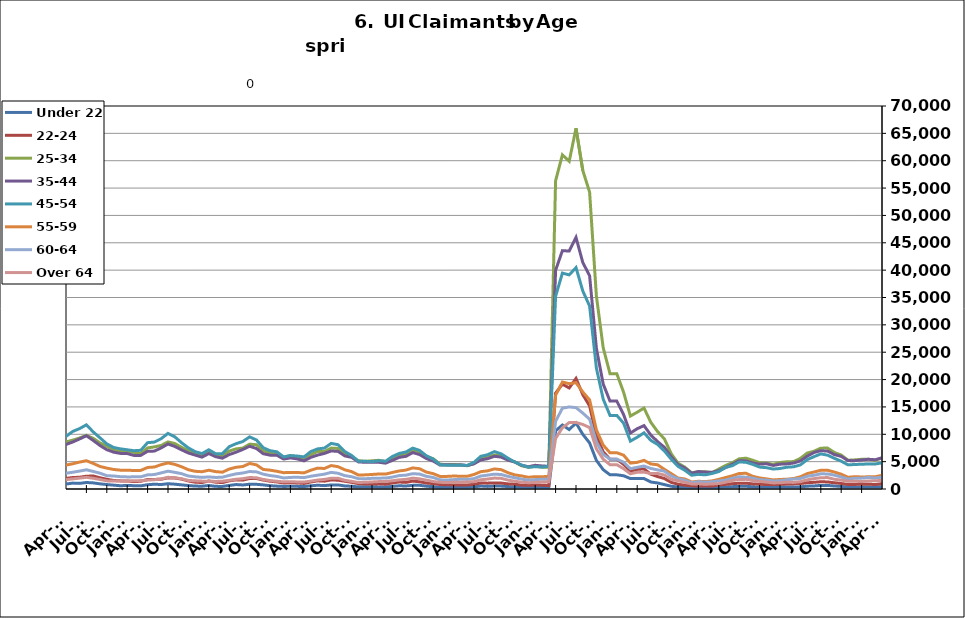
| Category | Under 22 | 22-24 | 25-34 | 35-44 | 45-54 | 55-59 | 60-64 | Over 64 |
|---|---|---|---|---|---|---|---|---|
| 1995-02-28 | 535 | 933 | 5740 | 6206 | 4029 | 1255 | 625 | 276 |
| 1995-03-31 | 534 | 992 | 5856 | 6433 | 4297 | 1294 | 686 | 323 |
| 1995-04-30 | 603 | 1125 | 6814 | 6965 | 4447 | 1392 | 730 | 338 |
| 1995-05-31 | 626 | 1171 | 7442 | 7404 | 4702 | 1383 | 751 | 333 |
| 1995-06-30 | 625 | 1218 | 7514 | 7778 | 4867 | 1435 | 813 | 366 |
| 1995-07-31 | 710 | 1296 | 8612 | 8864 | 5537 | 1595 | 891 | 407 |
| 1995-08-31 | 729 | 1248 | 8185 | 8719 | 5400 | 1604 | 982 | 406 |
| 1995-09-30 | 578 | 1028 | 6615 | 7150 | 4534 | 1351 | 862 | 338 |
| 1995-10-31 | 554 | 957 | 5805 | 6461 | 4159 | 1205 | 741 | 287 |
| 1995-11-30 | 468 | 845 | 5201 | 5826 | 3927 | 1155 | 702 | 254 |
| 1995-12-31 | 517 | 858 | 5350 | 5974 | 4010 | 1153 | 672 | 263 |
| 1996-01-31 | 543 | 927 | 5431 | 6086 | 4208 | 1221 | 685 | 301 |
| 1996-02-29 | 617 | 999 | 5667 | 6535 | 4480 | 1312 | 747 | 305 |
| 1996-03-31 | 622 | 981 | 5896 | 6557 | 4514 | 1362 | 763 | 306 |
| 1996-04-30 | 680 | 1140 | 7032 | 7649 | 5088 | 1527 | 856 | 345 |
| 1996-05-31 | 689 | 1163 | 7220 | 7819 | 5070 | 1521 | 832 | 366 |
| 1996-06-30 | 661 | 1145 | 7344 | 8173 | 5391 | 1568 | 844 | 388 |
| 1996-07-31 | 762 | 1250 | 8375 | 9181 | 6036 | 1755 | 973 | 432 |
| 1996-08-31 | 746 | 1145 | 7829 | 8585 | 5586 | 1651 | 950 | 435 |
| 1996-09-30 | 635 | 992 | 6399 | 7097 | 4790 | 1462 | 804 | 425 |
| 1996-10-31 | 572 | 851 | 5448 | 6291 | 4192 | 1259 | 693 | 340 |
| 1996-11-30 | 531 | 827 | 5003 | 5921 | 3908 | 1153 | 602 | 315 |
| 1996-12-31 | 521 | 789 | 4710 | 5510 | 3673 | 1110 | 610 | 284 |
| 1997-01-31 | 559 | 841 | 5203 | 6172 | 4321 | 1255 | 731 | 328 |
| 1997-02-28 | 556 | 841 | 5187 | 6162 | 4311 | 1250 | 727 | 326 |
| 1997-03-31 | 499 | 806 | 5125 | 6037 | 4176 | 1294 | 702 | 363 |
| 1997-04-30 | 545 | 885 | 5753 | 6709 | 4248 | 1339 | 734 | 339 |
| 1997-05-31 | 612 | 941 | 6146 | 7153 | 4458 | 1348 | 801 | 336 |
| 1997-06-30 | 623 | 995 | 6240 | 7298 | 4662 | 1302 | 776 | 348 |
| 1997-07-31 | 716 | 1154 | 7168 | 8554 | 5489 | 1509 | 903 | 415 |
| 1997-08-31 | 684 | 1072 | 6853 | 8093 | 5222 | 1487 | 837 | 416 |
| 1997-09-30 | 579 | 912 | 5522 | 6592 | 4348 | 1285 | 705 | 380 |
| 1997-10-31 | 516 | 817 | 4894.5 | 5892.5 | 3945 | 1159 | 625 | 344.5 |
| 1997-11-30 | 453 | 722 | 4267 | 5193 | 3542 | 1033 | 545 | 309 |
| 1997-12-31 | 413 | 682 | 3792 | 4755 | 3300 | 1023 | 490 | 266 |
| 1998-01-31 | 489 | 741 | 4044 | 5115 | 3513 | 1099 | 525 | 267 |
| 1998-02-28 | 435 | 684 | 3864 | 4903 | 3549 | 1043 | 571 | 285 |
| 1998-03-31 | 416 | 680 | 3855 | 5086 | 3703 | 1176 | 604 | 297 |
| 1998-04-30 | 592 | 813 | 5092 | 6219 | 4262 | 1336 | 688 | 332 |
| 1998-05-31 | 579 | 849 | 5319 | 6766 | 4554 | 1382 | 729 | 360 |
| 1998-06-30 | 568 | 899 | 5557 | 7101 | 4897 | 1405 | 783 | 367 |
| 1998-07-31 | 691 | 1031 | 6472 | 8095 | 5562 | 1589 | 880 | 392 |
| 1998-08-31 | 673 | 1007 | 6326 | 7950 | 5369 | 1574 | 935 | 393 |
| 1998-09-30 | 548 | 838 | 5206 | 6768 | 4703 | 1432 | 849 | 373 |
| 1998-10-31 | 496 | 776 | 4437 | 5582 | 3875 | 1250 | 711 | 302 |
| 1998-11-30 | 456 | 761 | 4182 | 5332 | 4015 | 1296 | 694 | 308 |
| 1998-12-31 | 442 | 722 | 4010 | 5198 | 4062 | 1331 | 656 | 290 |
| 1999-01-31 | 503 | 830 | 4502 | 5761 | 4521 | 1490 | 751 | 297 |
| 1999-02-28 | 463 | 756 | 4267 | 5576 | 4431 | 1470 | 767 | 301 |
| 1999-03-31 | 435 | 688 | 4119 | 5519 | 4403 | 1516 | 765 | 331 |
| 1999-04-30 | 591 | 949 | 5292 | 7089 | 5468 | 1724 | 914 | 489 |
| 1999-05-31 | 674 | 911 | 5611 | 7459 | 5457 | 1710 | 934 | 500 |
| 1999-06-30 | 640 | 906 | 5660 | 7503 | 5333 | 1695 | 920 | 495 |
| 1999-07-31 | 766 | 1132 | 6820 | 9256 | 6620 | 1981 | 1001 | 549 |
| 1999-08-31 | 738 | 1117 | 6737 | 9030 | 6670 | 2019 | 1075 | 582 |
| 1999-09-30 | 600 | 968 | 5167 | 7169 | 5458 | 1712 | 892 | 465 |
| 1999-10-31 | 494 | 813 | 4501 | 6048 | 4682 | 1443 | 743 | 363 |
| 1999-11-30 | 464 | 768 | 4228 | 5593 | 4564 | 1392 | 702 | 313 |
| 1999-12-31 | 468.5 | 754.5 | 4149 | 5486.5 | 4505 | 1429 | 673 | 304 |
| 2000-01-31 | 473 | 741 | 4070 | 5380 | 4446 | 1466 | 644 | 295 |
| 2000-02-29 | 460 | 691 | 3807 | 5357 | 4470 | 1469 | 707 | 310 |
| 2000-03-31 | 412 | 652 | 3864 | 5499 | 4568 | 1508 | 816 | 389 |
| 2000-04-30 | 585 | 829 | 4741 | 6891 | 5127 | 1631 | 906 | 451 |
| 2000-05-31 | 627 | 875 | 5086 | 7211 | 5238 | 1598 | 956 | 489 |
| 2000-06-30 | 675 | 983 | 5624 | 7826 | 5562 | 1669 | 941 | 524 |
| 2000-07-31 | 802 | 1109 | 6475 | 9102 | 6450 | 1927 | 1097 | 594 |
| 2000-08-31 | 787 | 1058 | 6045 | 8732 | 6157 | 1894 | 1085 | 616 |
| 2000-09-30 | 607 | 897 | 4766 | 6864 | 5037 | 1486 | 902 | 479 |
| 2000-10-31 | 544 | 760 | 4267 | 5897 | 4465 | 1323 | 762 | 394 |
| 2000-11-30 | 535 | 797 | 3982 | 5439 | 4318 | 1256 | 702 | 396 |
| 2000-12-31 | 508 | 832 | 3891 | 5255 | 4218 | 1246 | 694 | 361 |
| 2001-01-31 | 627 | 892 | 4229 | 5724 | 4777 | 1300 | 721 | 393 |
| 2001-02-28 | 643 | 934 | 4553 | 6302 | 5224 | 1529 | 849 | 472 |
| 2001-03-31 | 412 | 648 | 3625 | 5081 | 4551 | 1413 | 778 | 440 |
| 2001-04-30 | 875 | 1276 | 6577 | 8914 | 7196 | 2144 | 1185 | 639 |
| 2001-05-31 | 944 | 1399 | 7133 | 9570 | 7651 | 2265 | 1231 | 679 |
| 2001-06-30 | 1041 | 1584 | 8072 | 11034 | 8621 | 2613 | 1398 | 756 |
| 2001-07-31 | 1135 | 1806 | 9038 | 12514 | 9691 | 2970 | 1611 | 848 |
| 2001-08-31 | 1116 | 1776 | 8753 | 12045 | 9560 | 2963 | 1691 | 898 |
| 2001-09-30 | 1046 | 1705 | 8118 | 11025 | 8788 | 2784 | 1608 | 833 |
| 2001-10-31 | 1094 | 1785 | 8459 | 11114 | 8850 | 2772 | 1610 | 777 |
| 2001-11-30 | 1154 | 1931 | 9131 | 11576 | 9447 | 2973 | 1661 | 778 |
| 2001-12-31 | 1280 | 2191 | 9917 | 11961 | 9905 | 3152 | 1740 | 780 |
| 2002-01-31 | 1330 | 2255 | 10364 | 12730 | 10592 | 3378 | 1843 | 821 |
| 2002-02-28 | 1347 | 2339 | 10349 | 12730 | 10784 | 3499 | 1861 | 867 |
| 2002-03-31 | 1266 | 2231 | 9963 | 12747 | 10614 | 3499 | 1867 | 979 |
| 2002-04-30 | 1412 | 2488 | 11603 | 15825 | 13571 | 4631 | 2389 | 1146 |
| 2002-05-31 | 1455 | 2421 | 11243 | 15509 | 13148 | 4374 | 2359 | 1195 |
| 2002-06-30 | 1534 | 2479 | 11416 | 15594 | 13261 | 4343 | 2365 | 1180 |
| 2002-07-31 | 1513 | 2614 | 11895 | 16242 | 13727 | 4439 | 2428 | 1255 |
| 2002-08-31 | 1022 | 1977 | 8719 | 12054 | 10588 | 3454 | 1990 | 1047 |
| 2002-09-30 | 1391 | 2528 | 10478 | 14010 | 12008 | 3847 | 2161 | 1166 |
| 2002-10-31 | 1401 | 2385 | 9826 | 12727 | 10778 | 3498 | 1886 | 973 |
| 2002-11-30 | 1344 | 2390 | 9846 | 12059 | 10297 | 3367 | 1833 | 958 |
| 2002-12-31 | 1311 | 2403 | 9841 | 11670 | 10177 | 3369 | 1871 | 894 |
| 2003-01-31 | 1311 | 2403 | 9841 | 11670 | 10177 | 3369 | 1871 | 894 |
| 2003-02-28 | 1367 | 2275 | 9730 | 12433 | 10806 | 3687 | 2016 | 974 |
| 2003-03-31 | 1367 | 2357 | 9844 | 12620 | 11167 | 3825 | 2151 | 1094 |
| 2003-04-30 | 1549 | 2525 | 10619 | 14142 | 12182 | 4004 | 2304 | 1190 |
| 2003-05-31 | 1663 | 2698 | 10843 | 14795 | 12539 | 4102 | 2395 | 1256 |
| 2003-06-30 | 1755 | 2770 | 11350 | 15575 | 13251 | 4301 | 2493 | 1325 |
| 2003-07-31 | 1748 | 2791 | 11577 | 15863 | 13772 | 4465 | 2593 | 1371 |
| 2003-08-31 | 1718 | 2653 | 10998 | 15261 | 13219 | 4325 | 2522 | 1359 |
| 2003-09-30 | 1494 | 2521 | 10071 | 13565 | 11659 | 3828 | 2278 | 1286 |
| 2003-10-31 | 1329 | 2432 | 9388 | 12107 | 10693 | 3567 | 2036 | 1129 |
| 2003-11-30 | 1191 | 2226 | 8954 | 11297 | 10037 | 3414 | 2004 | 1068 |
| 2003-12-31 | 1206 | 2184 | 8530 | 10413 | 9335 | 3215 | 1854 | 994 |
| 2004-01-31 | 1216 | 2171 | 8382 | 9858 | 8955 | 2992 | 1736 | 963 |
| 2004-02-29 | 1118 | 1879 | 7614 | 8935 | 8176 | 2761 | 1617 | 943 |
| 2004-03-31 | 1099 | 1749 | 7152 | 8565 | 7769 | 2686 | 1608 | 981 |
| 2004-04-30 | 1241 | 1951 | 7653 | 9981 | 8741 | 2872 | 1685 | 1056 |
| 2004-05-31 | 1245 | 1934 | 7651 | 10203 | 8820 | 2928 | 1703 | 1079 |
| 2004-06-30 | 1316 | 2086 | 8172 | 10636 | 9362 | 3146 | 1843 | 1081 |
| 2004-07-31 | 1476 | 2265 | 8795 | 11511 | 10439 | 3497 | 2008 | 1171 |
| 2004-08-31 | 1390 | 2055 | 8008 | 10418 | 9514 | 3304 | 1909 | 1105 |
| 2004-09-30 | 1129 | 1820 | 6987 | 8661 | 7694 | 2755 | 1623 | 1046 |
| 2004-10-31 | 1037 | 1675 | 6590 | 7964 | 7029 | 2459 | 1461 | 882 |
| 2004-11-30 | 954 | 1638 | 6342 | 7570 | 6733 | 2294 | 1383 | 841 |
| 2004-12-31 | 857 | 1533 | 5921 | 6991 | 6333 | 2225 | 1287 | 764 |
| 2005-01-31 | 893 | 1539 | 6047 | 7410 | 6682 | 2253 | 1274 | 788 |
| 2005-02-28 | 846 | 1361 | 5650 | 6952 | 6404 | 2198 | 1326 | 786 |
| 2005-03-31 | 747 | 1258 | 5313 | 6595 | 6251 | 2151 | 1327 | 742 |
| 2005-04-30 | 877 | 1375 | 5696 | 7717 | 7230 | 2440 | 1401 | 844 |
| 2005-05-31 | 854 | 1408 | 5674 | 7905 | 7454 | 2482 | 1453 | 858 |
| 2005-06-30 | 819 | 1444 | 6028 | 8565 | 7899 | 2613 | 1547 | 890 |
| 2005-07-31 | 900 | 1461 | 6395 | 9124 | 8614 | 2864 | 1640 | 1004 |
| 2005-08-31 | 805 | 1439 | 5917 | 8271 | 8076 | 2692 | 1587 | 945 |
| 2005-09-30 | 631 | 1209 | 4978 | 6413 | 6203 | 2116 | 1312 | 724 |
| 2005-10-31 | 638 | 1134 | 4602 | 6028 | 5688 | 1997 | 1171 | 656 |
| 2005-11-30 | 564 | 1071 | 4409 | 5563 | 5105 | 1791 | 1035 | 580 |
| 2005-12-31 | 523 | 987 | 4014 | 4983 | 4531 | 1673 | 968 | 546 |
| 2006-01-31 | 531 | 925 | 3900 | 5012 | 4793 | 1691 | 1008 | 539 |
| 2006-02-28 | 447 | 804 | 3534 | 4388 | 4403 | 1586 | 980 | 549 |
| 2006-03-31 | 399 | 785 | 3455 | 4472 | 4584 | 1680 | 1069 | 618 |
| 2006-04-30 | 527 | 945 | 4004 | 5859 | 5921 | 1965 | 1251 | 744 |
| 2006-05-31 | 594 | 964 | 4205 | 6365 | 6369 | 2156 | 1327 | 792 |
| 2006-06-30 | 660 | 1113 | 4742 | 7052 | 7094 | 2386 | 1474 | 933 |
| 2006-07-31 | 771 | 1183 | 5214 | 7974 | 8007 | 2685 | 1635 | 1072 |
| 2006-08-31 | 737 | 1202 | 5116 | 7524 | 7553 | 2671 | 1590 | 1019 |
| 2006-09-30 | 596 | 1086 | 4608 | 6175 | 6389 | 2256 | 1287 | 812 |
| 2006-10-31 | 596 | 1056 | 4585 | 5758 | 5788 | 2026 | 1164 | 696 |
| 2006-11-30 | 542 | 1003 | 4370 | 5304 | 5388 | 1812 | 1082 | 604 |
| 2006-12-31 | 553 | 1102 | 4425 | 5291 | 5310 | 1801 | 1099 | 603 |
| 2007-01-31 | 587 | 1147 | 4542 | 5619 | 5506 | 1920 | 1174 | 663 |
| 2007-02-28 | 544 | 1090 | 4490 | 5562 | 5616 | 1982 | 1260 | 705 |
| 2007-03-31 | 558 | 1089 | 4498 | 5595 | 5708 | 2016 | 1378 | 717 |
| 2007-04-30 | 760 | 1203 | 5015 | 6827 | 6871 | 2316 | 1536 | 856 |
| 2007-05-31 | 806 | 1285 | 5542 | 7679 | 7763 | 2571 | 1719 | 1021 |
| 2007-06-30 | 862 | 1340 | 6100 | 8324 | 8341 | 2812 | 1896 | 1060 |
| 2007-07-31 | 980 | 1524 | 6616 | 9184 | 9522 | 3226 | 2038 | 1250 |
| 2007-08-31 | 950 | 1510 | 6266 | 8359 | 8842 | 3033 | 1949 | 1157 |
| 2007-09-30 | 865 | 1595 | 6213 | 7798 | 7957 | 2790 | 1816 | 1090 |
| 2007-10-31 | 883 | 1517 | 6214 | 7229 | 7503 | 2574 | 1630 | 978 |
| 2007-11-15 | 816 | 1424 | 5981 | 6740 | 6999 | 2468 | 1510 | 860 |
| 2007-12-15 09:36:00 | 851 | 1536 | 6411 | 6986 | 7174 | 2572 | 1584 | 874 |
| 2008-01-14 19:12:00 | 963 | 1628 | 6836 | 7533 | 7742 | 2786 | 1744 | 940 |
| 2008-02-14 04:48:00 | 982 | 1565 | 6847 | 7767 | 8031 | 2958 | 1823 | 985 |
| 2008-03-15 14:24:00 | 1029 | 1666 | 7210 | 8036 | 8353 | 3105 | 1898 | 1085 |
| 2008-04-15 | 1182 | 1889 | 7894 | 9339 | 9822 | 3537 | 2184 | 1246 |
| 2008-05-15 09:36:00 | 1325 | 2099 | 8651 | 10315 | 11003 | 3871 | 2423 | 1448 |
| 2008-06-14 19:12:00 | 1405 | 2238 | 9567 | 11330 | 12040 | 4322 | 2650 | 1572 |
| 2008-07-15 04:48:00 | 1616 | 2488 | 10336 | 12349 | 13396 | 4698 | 3083 | 1801 |
| 2008-08-14 14:24:00 | 1753 | 2665 | 10716 | 12486 | 13444 | 4795 | 3139 | 1802 |
| 2008-09-14 | 1800 | 2924 | 11552 | 12686 | 13602 | 4801 | 3180 | 1811 |
| 2008-10-14 09:36:00 | 1936 | 3131 | 12284 | 13322 | 13831 | 4989 | 3183 | 1808 |
| 2008-11-13 19:12:00 | 2093 | 3414 | 13577 | 14724 | 15130 | 5413 | 3440 | 1946 |
| 2008-12-14 04:48:00 | 2495 | 4020 | 15380 | 16325 | 16846 | 6098 | 3755 | 2155 |
| 2009-01-13 14:24:00 | 3054 | 4678 | 17678 | 18452 | 19095 | 6788 | 4182 | 2364 |
| 2009-02-13 | 3531 | 5304 | 19793 | 20788 | 21601 | 7727 | 4836 | 2718 |
| 2009-03-15 09:36:00 | 3891 | 5925 | 22303 | 23139 | 24352 | 8876 | 5515 | 3141 |
| 2009-04-14 19:12:00 | 4291 | 6403 | 23925 | 25362 | 26817 | 9618 | 6020 | 3494 |
| 2009-05-15 04:48:00 | 4410 | 6521 | 24301 | 25794 | 27238 | 9735 | 6181 | 3529 |
| 2009-06-14 14:24:00 | 4405 | 6853 | 25234 | 26806 | 28296 | 10256 | 6673 | 3804 |
| 2009-07-15 | 4729 | 7280 | 26132 | 27836 | 29724 | 10830 | 6950 | 4125 |
| 2009-08-14 09:36:00 | 4717 | 7069 | 25281 | 26184 | 27877 | 10164 | 6719 | 3918 |
| 2009-09-13 19:12:00 | 4741 | 7291 | 25029 | 24981 | 26018 | 9679 | 6210 | 3594 |
| 2009-10-14 04:48:00 | 4656 | 7051 | 24241 | 23779 | 24730 | 9034 | 5817 | 3422 |
| 2009-11-13 14:24:00 | 4421 | 6817 | 23760 | 22851 | 23515 | 8627 | 5549 | 3297 |
| 2009-12-14 | 4232 | 6586 | 23118 | 22038 | 22501 | 8496 | 5370 | 3295 |
| 2010-01-13 09:36:00 | 4276 | 6583 | 22706 | 21421 | 22132 | 8135 | 5154 | 3134 |
| 2010-02-12 19:12:00 | 4133 | 6142 | 21386 | 20012 | 21036 | 7728 | 5039 | 3047 |
| 2010-03-15 04:48:00 | 3784 | 5822 | 20418 | 19073 | 20556 | 7446 | 4983 | 3062 |
| 2010-04-14 14:24:00 | 3731 | 5751 | 20058 | 19261 | 21012 | 7449 | 5078 | 2936 |
| 2010-05-15 | 3516 | 5553 | 19393 | 18793 | 20409 | 7213 | 4923 | 2915 |
| 2010-06-14 09:36:00 | 3450 | 5640 | 19615 | 19385 | 20781 | 7547 | 5293 | 3043 |
| 2010-07-14 19:12:00 | 3536 | 5781 | 19820 | 19714 | 21269 | 7946 | 5439 | 3330 |
| 2010-08-14 04:48:00 | 3477 | 5590 | 18902 | 18548 | 19686 | 7561 | 5039 | 3181 |
| 2010-09-13 14:24:00 | 3083 | 5332 | 17344 | 16712 | 17408 | 6775 | 4612 | 2859 |
| 2010-10-14 | 3004 | 5138 | 17187 | 16492 | 17042 | 6713 | 4418 | 2779 |
| 2010-11-13 09:36:00 | 2724 | 4771 | 16387 | 15438 | 16061 | 6360 | 4209 | 2601 |
| 2010-12-13 19:12:00 | 2335 | 4159 | 15175 | 14143 | 14646 | 5823 | 4003 | 2480 |
| 2011-01-13 04:48:00 | 2530 | 4343 | 15492 | 14596 | 15561 | 6250 | 4059 | 2487 |
| 2011-02-12 14:24:00 | 2609 | 4202 | 15131 | 14142 | 15320 | 6044 | 4041 | 2517 |
| 2011-03-15 | 2290 | 3998 | 14370 | 13505 | 14523 | 5925 | 3990 | 2470 |
| 2011-04-14 09:36:00 | 2563 | 4190 | 14834 | 14445 | 15508 | 6130 | 3916 | 2488 |
| 2011-05-14 19:12:00 | 2642 | 4217 | 14917 | 14494 | 16051 | 6156 | 4129 | 2602 |
| 2011-06-14 04:48:00 | 2767 | 4676 | 17673 | 17404 | 19563 | 7763 | 5398 | 3653 |
| 2011-07-14 14:24:00 | 3027 | 4815 | 17530 | 17197 | 19880 | 7870 | 5384 | 3686 |
| 2011-08-14 | 2900 | 4498 | 15970 | 15020 | 17035 | 6697 | 4394 | 2956 |
| 2011-09-13 09:36:00 | 2531 | 4156 | 14609 | 13818 | 15092 | 5903 | 3881 | 2687 |
| 2011-10-13 19:12:00 | 2452 | 3959 | 14501 | 13415 | 14565 | 5635 | 3734 | 2491 |
| 2011-11-13 04:48:00 | 2197 | 3615 | 13732 | 12410 | 13698 | 5345 | 3574 | 2339 |
| 2011-12-13 14:24:00 | 1938 | 3290 | 13130 | 11646 | 13054 | 5089 | 3380 | 2177 |
| 2012-01-13 | 2098 | 3424 | 13293 | 11897 | 13400 | 5218 | 3448 | 2197 |
| 2012-02-12 09:36:00 | 2047 | 3428 | 12569 | 11400 | 12931 | 5177 | 3445 | 2212 |
| 2012-03-13 19:12:00 | 1870 | 3252 | 11913 | 10922 | 12476 | 4948 | 3317 | 2155 |
| 2012-04-13 04:48:00 | 2063 | 3590 | 12479 | 11814 | 13464 | 5278 | 3509 | 2287 |
| 2012-05-13 14:24:00 | 2260 | 3828 | 12852 | 12063 | 14139 | 5562 | 3628 | 2485 |
| 2012-06-13 | 2147 | 3747 | 13008 | 12659 | 14694 | 5791 | 3902 | 2736 |
| 2012-07-13 09:36:00 | 2358 | 4087 | 14109 | 13412 | 15770 | 6346 | 4156 | 3086 |
| 2012-08-12 19:12:00 | 1887 | 3284 | 11852 | 11102 | 13153 | 5396 | 3487 | 2583 |
| 2012-09-12 04:48:00 | 1524 | 2903 | 10742 | 10051 | 11393 | 4726 | 3103 | 2327 |
| 2012-10-12 14:24:00 | 1289 | 2603 | 10123 | 9339 | 10510 | 4405 | 2813 | 2032 |
| 2012-11-12 | 945 | 2155 | 8870 | 8273 | 9193 | 3781 | 2520 | 1702 |
| 2012-12-12 09:36:00 | 937 | 2201 | 8913 | 8210 | 9124 | 3816 | 2491 | 1722 |
| 2013-01-11 19:12:00 | 934 | 2199 | 9132 | 8579 | 9635 | 4095 | 2569 | 1667 |
| 2013-02-11 04:48:00 | 915 | 1996 | 8343 | 8072 | 9253 | 4034 | 2623 | 1715 |
| 2013-03-13 14:24:00 | 845 | 1934 | 8092 | 7955 | 9007 | 3929 | 2561 | 1667 |
| 2013-04-13 | 1055 | 2124 | 8637 | 8445 | 9891 | 4204 | 2666 | 1698 |
| 2013-05-13 09:36:00 | 1160 | 2394 | 9413 | 8898 | 10920 | 4574 | 2940 | 1871 |
| 2013-06-12 19:12:00 | 1145 | 2351 | 9732 | 9510 | 11293 | 4830 | 3115 | 1976 |
| 2013-07-13 04:48:00 | 1294 | 2558 | 10421 | 10174 | 12520 | 5363 | 3434 | 2233 |
| 2013-08-12 14:24:00 | 1238 | 2519 | 10150 | 9771 | 11886 | 5067 | 3372 | 2140 |
| 2013-09-12 | 1116 | 2214 | 9323 | 8874 | 10178 | 4389 | 2964 | 1871 |
| 2013-10-12 09:36:00 | 1000 | 2044 | 8893 | 8509 | 9449 | 4200 | 2701 | 1709 |
| 2013-11-11 19:12:00 | 842 | 1927 | 8532 | 8049 | 8950 | 4028 | 2665 | 1675 |
| 2013-12-12 04:48:00 | 753 | 1854 | 8098 | 7692 | 8612 | 3913 | 2557 | 1655 |
| 2014-01-11 14:24:00 | 788 | 1846 | 8270 | 7762 | 8786 | 4128 | 2606 | 1642 |
| 2014-02-11 | 795 | 1817 | 8124 | 7677 | 8944 | 4189 | 2646 | 1728 |
| 2014-03-13 09:36:00 | 782 | 1741 | 8319 | 8063 | 9583 | 4550 | 3048 | 2040 |
| 2014-04-12 19:12:00 | 905 | 1940 | 8594 | 8138 | 9620 | 4372 | 2886 | 1706 |
| 2014-05-13 04:48:00 | 1079 | 2093 | 8933 | 8593 | 10522 | 4609 | 3062 | 1850 |
| 2014-06-12 14:24:00 | 1028 | 2152 | 9323 | 9148 | 11040 | 4920 | 3274 | 1985 |
| 2014-07-13 | 1189 | 2333 | 9808 | 9735 | 11729 | 5171 | 3509 | 2133 |
| 2014-08-14 | 1119 | 2379 | 9259 | 8876 | 10438 | 4678 | 3210 | 1962 |
| 2014-09-13 09:36:00 | 943 | 2048 | 8430 | 7946 | 9358 | 4119 | 2891 | 1734 |
| 2014-10-13 19:12:00 | 816 | 1781 | 7821 | 7185 | 8244 | 3813 | 2437 | 1486 |
| 2014-11-13 04:48:00 | 703 | 1557 | 7150 | 6736 | 7594 | 3571 | 2374 | 1466 |
| 2014-12-13 14:24:00 | 597 | 1482 | 6833 | 6507 | 7340 | 3442 | 2255 | 1458 |
| 2015-01-13 | 646 | 1466 | 6927 | 6477 | 7168 | 3432 | 2210 | 1429 |
| 2015-02-12 09:36:00 | 607 | 1346 | 6696 | 6134 | 6999 | 3383 | 2220 | 1525 |
| 2015-03-14 19:12:00 | 577 | 1416 | 6499 | 6145 | 7077 | 3405 | 2233 | 1530 |
| 2015-04-14 04:48:00 | 784 | 1736 | 7505 | 6901 | 8468 | 3935 | 2586 | 1624 |
| 2015-05-14 14:24:00 | 875 | 1749 | 7696 | 6925 | 8578 | 4020 | 2644 | 1698 |
| 2015-06-14 | 818 | 1789 | 7961 | 7519 | 9200 | 4452 | 2943 | 1839 |
| 2015-07-14 09:36:00 | 966 | 2033 | 8609 | 8223 | 10167 | 4766 | 3254 | 2136 |
| 2015-08-13 19:12:00 | 880 | 2007 | 8302 | 7779 | 9530 | 4503 | 3045 | 2073 |
| 2015-09-13 04:48:00 | 752 | 1807 | 7615 | 7153 | 8455 | 4067 | 2798 | 1870 |
| 2015-10-13 14:24:00 | 630 | 1461 | 6995 | 6578 | 7509 | 3519 | 2375 | 1570 |
| 2015-11-13 | 533 | 1246 | 6491 | 6196 | 6815 | 3237 | 2224 | 1493 |
| 2015-12-13 09:36:00 | 512 | 1179 | 6242 | 5823 | 6474 | 3158 | 2123 | 1439 |
| 2016-01-12 19:12:00 | 646 | 1466 | 6927 | 6477 | 7168 | 3432 | 2210 | 1429 |
| 2016-02-12 04:48:00 | 482 | 1246 | 6101 | 5912 | 6452 | 3180 | 2110 | 1385 |
| 2016-03-13 14:24:00 | 474 | 1170 | 6011 | 5629 | 6452 | 3073 | 2152 | 1420 |
| 2016-04-13 | 648 | 1494 | 6917 | 6287 | 7737 | 3648 | 2483 | 1600 |
| 2016-05-13 09:36:00 | 812 | 1670 | 7326 | 6725 | 8279 | 3967 | 2765 | 1776 |
| 2016-06-12 19:12:00 | 738 | 1622 | 7479 | 7230 | 8681 | 4111 | 2920 | 1886 |
| 2016-07-13 04:48:00 | 875 | 1919 | 8193 | 7814 | 9525 | 4662 | 3196 | 2105 |
| 2016-08-12 14:24:00 | 858 | 1920 | 8091 | 7407 | 8969 | 4420 | 3130 | 2050 |
| 2016-09-12 | 752 | 1632 | 6992 | 6450 | 7548 | 3573 | 2713 | 1747 |
| 2016-10-12 09:36:00 | 602 | 1423 | 6590 | 6190 | 6998 | 3448 | 2457 | 1544 |
| 2016-11-11 19:12:00 | 523 | 1296 | 6418 | 6179 | 6801 | 3241 | 2299 | 1410 |
| 2016-12-12 04:48:00 | 468 | 1096 | 5827 | 5472 | 5867 | 2981 | 2019 | 1311 |
| 2017-01-11 14:24:00 | 495 | 1150 | 6111 | 5679 | 6108 | 3035 | 2115 | 1342 |
| 2017-02-11 | 484 | 1109 | 5882 | 5500 | 6023 | 3023 | 2148 | 1289 |
| 2017-03-13 09:36:00 | 442 | 1015 | 5634 | 5148 | 5865 | 2942 | 2075 | 1278 |
| 2017-04-12 19:12:00 | 585 | 1285 | 6292 | 5783 | 6842 | 3434 | 2336 | 1435 |
| 2017-05-13 04:48:00 | 686 | 1492 | 6844 | 6200 | 7332 | 3817 | 2526 | 1637 |
| 2017-06-12 14:24:00 | 623 | 1435 | 6852 | 6505 | 7473 | 3751 | 2713 | 1754 |
| 2017-07-13 | 745 | 1658 | 7483 | 6953 | 8339 | 4284 | 3038 | 1964 |
| 2017-08-12 09:36:00 | 745 | 1605 | 7411 | 6880 | 8092 | 4080 | 2878 | 1966 |
| 2017-09-11 19:12:00 | 559 | 1420 | 6481 | 6045 | 6845 | 3511 | 2443 | 1591 |
| 2017-10-12 04:48:00 | 503 | 1224 | 5960 | 5790 | 6135 | 3181 | 2245 | 1400 |
| 2017-11-11 14:24:00 | 390 | 972 | 5167 | 4951 | 5077 | 2553 | 1887 | 1188 |
| 2017-12-12 | 413 | 914 | 5058 | 4876 | 5071 | 2585 | 1870 | 1226 |
| 2018-01-11 09:36:00 | 411 | 912 | 5154 | 4909 | 5000 | 2656 | 1952 | 1288 |
| 2018-02-10 19:12:00 | 383 | 940 | 5246 | 4884 | 5165 | 2743 | 1980 | 1355 |
| 2018-03-13 04:48:00 | 373 | 875 | 5018 | 4724 | 5075 | 2723 | 1999 | 1389 |
| 2018-04-12 14:24:00 | 478 | 1104 | 5584 | 5240 | 5944 | 3026 | 2179 | 1506 |
| 2018-05-13 | 586 | 1275 | 6280 | 5780 | 6500 | 3300 | 2452 | 1670 |
| 2018-06-12 09:36:00 | 554 | 1207 | 6302 | 5974 | 6766 | 3462 | 2534 | 1762 |
| 2018-07-12 19:12:00 | 666 | 1445 | 7024 | 6656 | 7473 | 3858 | 2810 | 1989 |
| 2018-08-12 04:48:00 | 671 | 1323 | 6823 | 6293 | 7046 | 3706 | 2722 | 1850 |
| 2018-09-11 14:24:00 | 518 | 1084 | 5965 | 5563 | 6066 | 3091 | 2318 | 1618 |
| 2018-10-12 | 419 | 985 | 5538 | 5106 | 5464 | 2806 | 2102 | 1367 |
| 2018-11-11 09:36:00 | 306 | 808 | 4542 | 4371 | 4433 | 2297 | 1673 | 1222 |
| 2018-12-11 19:12:00 | 328 | 771 | 4439 | 4429 | 4340 | 2303 | 1646 | 1174 |
| 2019-01-11 04:48:00 | 327 | 743 | 4491 | 4378 | 4359 | 2368 | 1715 | 1218 |
| 2019-02-10 14:24:00 | 338 | 739 | 4402 | 4415 | 4345 | 2337 | 1773 | 1237 |
| 2019-03-13 | 306 | 738 | 4246 | 4293 | 4304 | 2328 | 1756 | 1281 |
| 2019-04-12 09:36:00 | 396 | 850 | 4657 | 4603 | 4871 | 2655 | 1900 | 1347 |
| 2019-05-12 19:12:00 | 541 | 1092 | 5700 | 5319 | 5974 | 3169 | 2371 | 1690 |
| 2019-06-12 04:48:00 | 476 | 1070 | 5822 | 5537 | 6262 | 3317 | 2534 | 1820 |
| 2019-07-12 14:24:00 | 538 | 1114 | 6206 | 5980 | 6836 | 3673 | 2717 | 1996 |
| 2019-08-12 | 528 | 1084 | 6044 | 5828 | 6422 | 3535 | 2645 | 1942 |
| 2019-09-11 09:36:00 | 445 | 932 | 5379 | 5275 | 5630 | 2979 | 2299 | 1624 |
| 2019-10-11 19:12:00 | 372 | 877 | 4949 | 4938 | 4922 | 2579 | 2058 | 1418 |
| 2019-11-11 04:48:00 | 332 | 701 | 4242 | 4332 | 4379 | 2392 | 1809 | 1247 |
| 2019-12-11 14:24:00 | 261 | 663 | 3977 | 4071 | 3974 | 2137 | 1619 | 1150 |
| 2020-01-11 | 272 | 724 | 4153 | 4331 | 4085 | 2258 | 1715 | 1206 |
| 2020-02-10 09:36:00 | 274 | 704 | 3992 | 4211 | 4020 | 2226 | 1784 | 1286 |
| 2020-03-11 19:12:00 | 291 | 630 | 3985 | 4153 | 4136 | 2332 | 1794 | 1308 |
| 2020-04-11 04:48:00 | 10628 | 17510 | 56346 | 39970 | 35225 | 17140 | 12379 | 9237 |
| 2020-05-11 14:24:00 | 11700 | 19159 | 61067 | 43562 | 39459 | 19553 | 14765 | 11197 |
| 2020-06-11 | 10859 | 18470 | 59897 | 43484 | 39131 | 19246 | 15000 | 12140 |
| 2020-07-11 09:36:00 | 12066 | 20204 | 65924 | 45983 | 40459 | 19436 | 14870 | 12160 |
| 2020-08-10 19:12:00 | 9989 | 17237 | 58218 | 41395 | 36191 | 17725 | 13875 | 11793 |
| 2020-09-10 04:48:00 | 8425 | 15201 | 54260 | 38988 | 33440 | 16290 | 12758 | 11237 |
| 2020-10-10 14:24:00 | 5224 | 9693 | 35264 | 25722 | 22091 | 10801 | 8611 | 7331 |
| 2020-11-10 | 3533 | 6796 | 25816 | 19183 | 16424 | 8018 | 6314 | 5449 |
| 2020-12-10 09:36:00 | 2593 | 5424 | 21071 | 16063 | 13455 | 6630 | 5449 | 4436 |
| 2021-01-09 19:12:00 | 2593 | 5424 | 21071 | 16063 | 13455 | 6630 | 5449 | 4436 |
| 2021-02-09 04:48:00 | 2420 | 4500 | 17683 | 13595 | 12022 | 6183 | 4899 | 3716 |
| 2021-03-11 14:24:00 | 1905 | 3249 | 13332 | 10225 | 8752 | 4732 | 3708 | 2781 |
| 2021-04-11 | 1938 | 3581 | 14034 | 11018 | 9457 | 4873 | 3962 | 3063 |
| 2021-05-11 09:36:00 | 1918 | 3672 | 14797 | 11584 | 10265 | 5238 | 4196 | 3085 |
| 2021-06-10 19:12:00 | 1277 | 2699 | 12194 | 9866 | 8892 | 4577 | 3756 | 2811 |
| 2021-07-11 04:48:00 | 1101 | 2270 | 10491 | 8653 | 8141 | 4427 | 3493 | 2859 |
| 2021-08-10 14:24:00 | 802 | 1912 | 9154 | 7615 | 6945 | 3597 | 3259 | 2545 |
| 2021-09-10 | 499 | 1209 | 6458 | 5895 | 5459 | 2812 | 2399 | 1777 |
| 2021-10-10 09:36:00 | 363 | 875 | 4718 | 4474 | 4141 | 2009 | 1903 | 1513 |
| 2021-11-09 19:12:00 | 251 | 681 | 3999 | 3834 | 3423 | 1835 | 1611 | 1206 |
| 2021-12-10 04:48:00 | 194 | 580 | 2968 | 2881 | 2517 | 1278 | 1152 | 925 |
| 2022-01-09 14:24:00 | 189 | 547 | 3143 | 3194 | 2678 | 1410 | 1338 | 928 |
| 2022-02-09 | 183 | 575 | 3165 | 3086 | 2590 | 1357 | 1270 | 874 |
| 2022-03-11 09:36:00 | 219 | 541 | 2988 | 3043 | 2829 | 1476 | 1313 | 912 |
| 2022-04-10 19:12:00 | 308 | 723 | 3641 | 3357 | 3189 | 1758 | 1482 | 986 |
| 2022-05-11 04:48:00 | 365 | 837 | 4299 | 3915 | 3953 | 2098 | 1624 | 1241 |
| 2022-06-10 14:24:00 | 427 | 969 | 4818 | 4519 | 4269 | 2418 | 1965 | 1563 |
| 2022-07-11 | 494 | 1055 | 5515 | 5179 | 4951 | 2831 | 2235 | 1736 |
| 2022-08-10 09:36:00 | 499 | 1062 | 5638 | 5140 | 4881 | 2872 | 2150 | 1763 |
| 2022-09-09 19:12:00 | 403 | 928 | 5254 | 4761 | 4495 | 2315 | 1987 | 1537 |
| 2022-10-10 04:48:00 | 356 | 870 | 4804 | 4541 | 4005 | 2021 | 1701 | 1388 |
| 2022-11-09 14:24:00 | 318 | 806 | 4749 | 4616 | 3897 | 1850 | 1634 | 1258 |
| 2022-12-10 | 316 | 798 | 4526 | 4305 | 3649 | 1660 | 1473 | 1109 |
| 2023-01-09 09:36:00 | 354 | 854 | 4842 | 4537 | 3747 | 1738 | 1502 | 1138 |
| 2023-02-08 19:12:00 | 380 | 900 | 4985 | 4592 | 3982 | 1792 | 1697 | 1241 |
| 2023-03-11 04:48:00 | 343 | 933 | 5009 | 4742 | 4059 | 1913 | 1812 | 1202 |
| 2023-04-10 14:24:00 | 399 | 1000 | 5597 | 5128 | 4410 | 2234 | 1914 | 1340 |
| 2023-05-11 | 516 | 1142 | 6568 | 5996 | 5370 | 2815 | 2322 | 1685 |
| 2023-06-10 09:36:00 | 557 | 1222 | 6899 | 6670 | 5910 | 3107 | 2509 | 1893 |
| 2023-07-10 19:12:00 | 656 | 1326 | 7469 | 7009 | 6415 | 3420 | 2775 | 2064 |
| 2023-08-10 04:48:00 | 654 | 1288 | 7473 | 6920 | 6181 | 3422 | 2756 | 2088 |
| 2023-09-09 14:24:00 | 548 | 1140 | 6670 | 6288 | 5609 | 3096 | 2527 | 1783 |
| 2023-10-10 | 472 | 1012 | 6205 | 5964 | 5087 | 2705 | 2199 | 1626 |
| 2023-11-09 09:36:00 | 356 | 814 | 5261 | 5187 | 4411 | 2146 | 1821 | 1415 |
| 2023-12-09 19:12:00 | 343 | 834 | 5324 | 5183 | 4479 | 2246 | 1976 | 1410 |
| 2024-01-09 04:48:00 | 392 | 875 | 5427 | 5298 | 4524 | 2201 | 1981 | 1374 |
| 2024-02-08 14:24:00 | 362 | 880 | 5434 | 5435 | 4573 | 2225 | 2100 | 1448 |
| 2024-03-10 | 397 | 819 | 5238 | 5345 | 4575 | 2237 | 2019 | 1525 |
| 2024-04-09 09:36:00 | 414 | 974 | 5691 | 5697 | 4770 | 2501 | 2163 | 1539 |